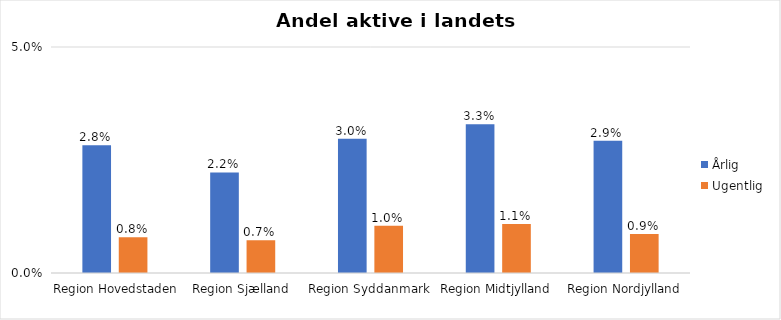
| Category | Årlig | Ugentlig |
|---|---|---|
| Region Hovedstaden | 0.028 | 0.008 |
| Region Sjælland | 0.022 | 0.007 |
| Region Syddanmark | 0.03 | 0.01 |
| Region Midtjylland | 0.033 | 0.011 |
| Region Nordjylland | 0.029 | 0.009 |